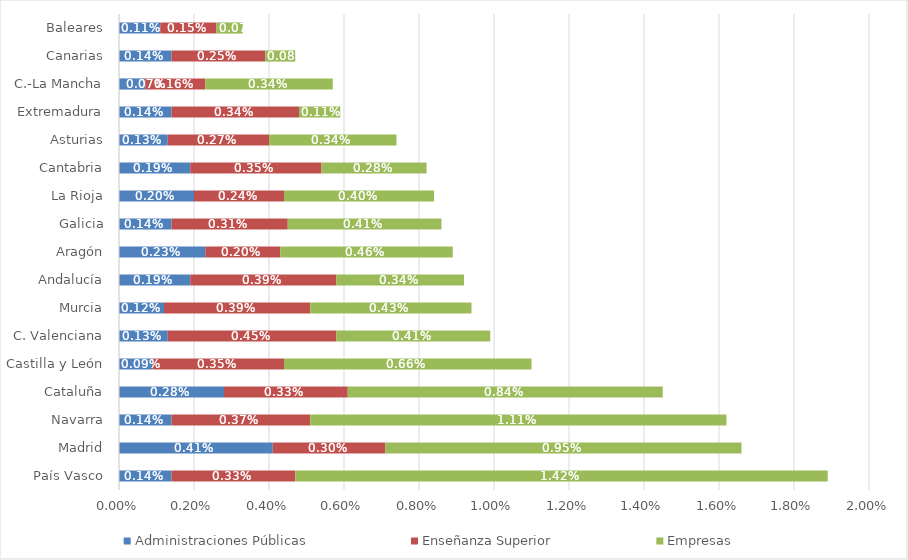
| Category | Administraciones Públicas | Enseñanza Superior | Empresas |
|---|---|---|---|
| País Vasco | 0.001 | 0.003 | 0.014 |
| Madrid | 0.004 | 0.003 | 0.01 |
| Navarra | 0.001 | 0.004 | 0.011 |
| Cataluña | 0.003 | 0.003 | 0.008 |
| Castilla y León | 0.001 | 0.004 | 0.007 |
| C. Valenciana | 0.001 | 0.004 | 0.004 |
| Murcia | 0.001 | 0.004 | 0.004 |
| Andalucía | 0.002 | 0.004 | 0.003 |
| Aragón | 0.002 | 0.002 | 0.005 |
| Galicia | 0.001 | 0.003 | 0.004 |
| La Rioja | 0.002 | 0.002 | 0.004 |
| Cantabria | 0.002 | 0.004 | 0.003 |
| Asturias | 0.001 | 0.003 | 0.003 |
| Extremadura | 0.001 | 0.003 | 0.001 |
| C.-La Mancha | 0.001 | 0.002 | 0.003 |
| Canarias | 0.001 | 0.002 | 0.001 |
| Baleares | 0.001 | 0.002 | 0.001 |